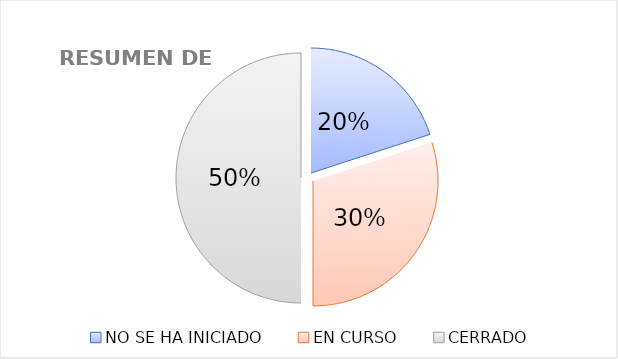
| Category | Series 0 |
|---|---|
| NO SE HA INICIADO | 2 |
| EN CURSO | 3 |
| CERRADO | 5 |